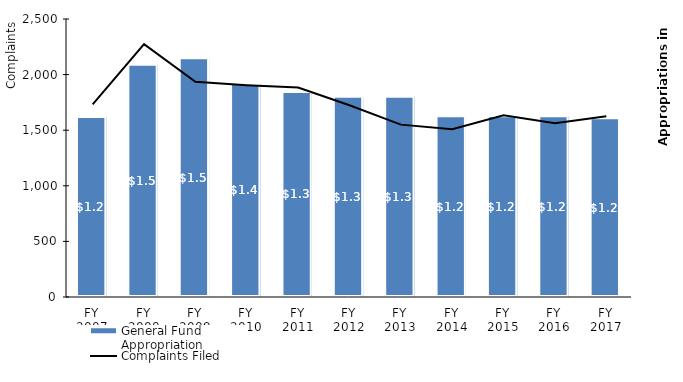
| Category | General Fund Appropriation |
|---|---|
| 0 | 1165322 |
| 1 | 1504036 |
| 2 | 1545232 |
| 3 | 1379861 |
| 4 | 1327807 |
| 5 | 1297069 |
| 6 | 1297069 |
| 7 | 1169540 |
| 8 | 1169540 |
| 9 | 1169540 |
| 10 | 1157062 |